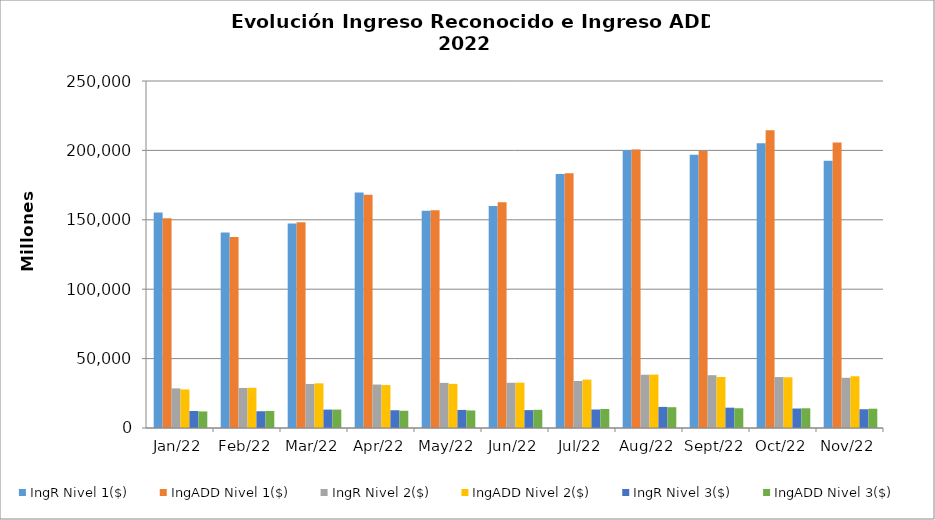
| Category | IngR Nivel 1($) | IngADD Nivel 1($) | IngR Nivel 2($) | IngADD Nivel 2($) | IngR Nivel 3($) | IngADD Nivel 3($) |
|---|---|---|---|---|---|---|
| 2022-01-01 | 155225437362 | 151178849432 | 28547993346 | 27775954666 | 12257925392 | 11944663903 |
| 2022-02-01 | 140841823135 | 137692649526 | 28860904096 | 28958336193 | 12065129052 | 12270732500 |
| 2022-03-01 | 147349096777 | 148256916665 | 31728552569 | 32185789729 | 13258262387 | 13270512087 |
| 2022-04-01 | 169625191245 | 168032266208 | 31298137543 | 30958643746 | 12794207424 | 12418288437 |
| 2022-05-01 | 156564044713 | 156885628684 | 32513796191 | 31795834661 | 13026248588 | 12643731147 |
| 2022-06-01 | 160022106862 | 162680094863 | 32596369289 | 32672556822 | 12876088229 | 13131395761 |
| 2022-07-01 | 183082746211 | 183578726288 | 33848950390 | 34853825268 | 13331536487 | 13728004403 |
| 2022-08-01 | 200140330630 | 200611075736 | 38362595525 | 38487463876 | 15198595169 | 14993618365 |
| 2022-09-01 | 196937834221 | 199517871727 | 38049063931 | 36744977037 | 14654386910 | 14226020775 |
| 2022-10-01 | 205095965990 | 214452013902 | 36694676081 | 36529440195 | 14044745319 | 14211556505 |
| 2022-11-01 | 192490668074 | 205763660256 | 36165534217 | 37277450462 | 13516996642 | 13901814778 |